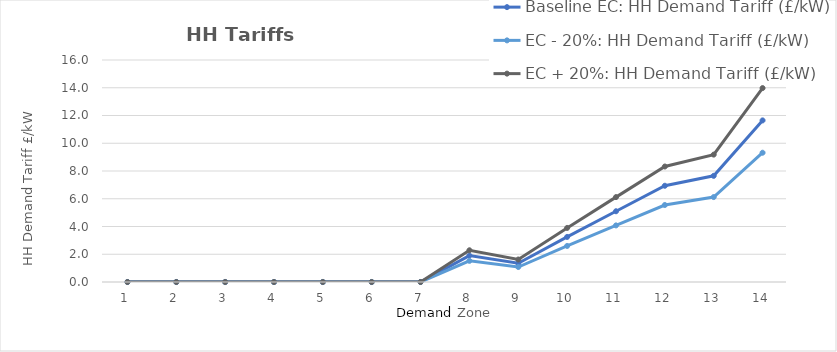
| Category | Baseline EC: HH Demand Tariff (£/kW) | EC - 20%: HH Demand Tariff (£/kW) | EC + 20%: HH Demand Tariff (£/kW) |
|---|---|---|---|
| 0 | 0 | 0 | 0 |
| 1 | 0 | 0 | 0 |
| 2 | 0 | 0 | 0 |
| 3 | 0 | 0 | 0 |
| 4 | 0 | 0 | 0 |
| 5 | 0 | 0 | 0 |
| 6 | 0 | 0 | 0 |
| 7 | 1.906 | 1.525 | 2.287 |
| 8 | 1.351 | 1.081 | 1.621 |
| 9 | 3.248 | 2.599 | 3.898 |
| 10 | 5.098 | 4.078 | 6.118 |
| 11 | 6.937 | 5.55 | 8.324 |
| 12 | 7.651 | 6.121 | 9.182 |
| 13 | 11.647 | 9.317 | 13.976 |